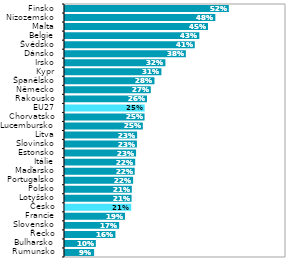
| Category | Series 1 |
|---|---|
| Rumunsko | 0.092 |
| Bulharsko | 0.098 |
| Řecko | 0.16 |
| Slovensko | 0.172 |
| Francie | 0.19 |
| Česko | 0.21 |
| Lotyšsko | 0.211 |
| Polsko | 0.212 |
| Portugalsko | 0.216 |
| Maďarsko | 0.221 |
| Itálie | 0.222 |
| Estonsko | 0.225 |
| Slovinsko | 0.228 |
| Litva | 0.228 |
| Lucembursko | 0.246 |
| Chorvatsko | 0.252 |
| EU27 | 0.252 |
| Rakousko | 0.26 |
| Německo | 0.272 |
| Španělsko | 0.283 |
| Kypr | 0.305 |
| Irsko | 0.318 |
| Dánsko | 0.383 |
| Švédsko | 0.411 |
| Belgie | 0.425 |
| Malta | 0.453 |
| Nizozemsko | 0.476 |
| Finsko | 0.519 |